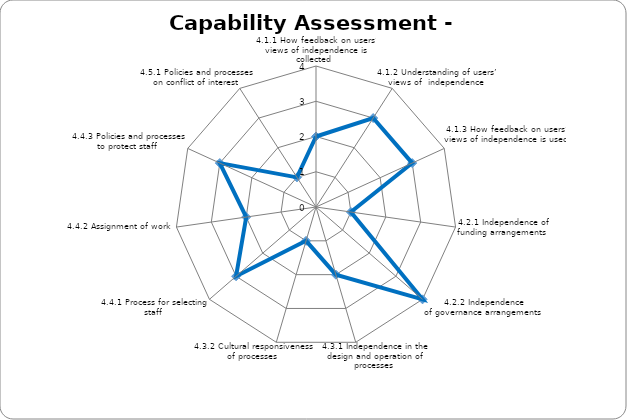
| Category | Series 0 |
|---|---|
| 4.1.1 How feedback on users’ views of independence is collected  | 2 |
| 4.1.2 Understanding of users’ views of  independence  | 3 |
| 4.1.3 How feedback on users’ views of independence is used  | 3 |
| 4.2.1 Independence of funding arrangements  | 1 |
| 4.2.2 Independence of governance arrangements  | 4 |
| 4.3.1 Independence in the design and operation of processes  | 2 |
| 4.3.2 Cultural responsiveness of processes  | 1 |
| 4.4.1 Process for selecting staff  | 3 |
| 4.4.2 Assignment of work  | 2 |
| 4.4.3 Policies and processes to protect staff  | 3 |
| 4.5.1 Policies and processes on conflict of interest  | 1 |